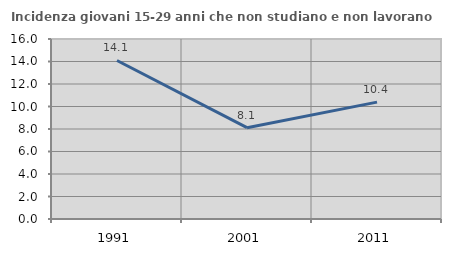
| Category | Incidenza giovani 15-29 anni che non studiano e non lavorano  |
|---|---|
| 1991.0 | 14.092 |
| 2001.0 | 8.117 |
| 2011.0 | 10.391 |